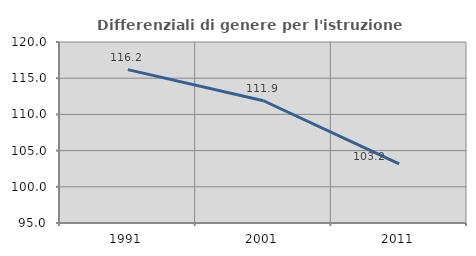
| Category | Differenziali di genere per l'istruzione superiore |
|---|---|
| 1991.0 | 116.189 |
| 2001.0 | 111.885 |
| 2011.0 | 103.177 |